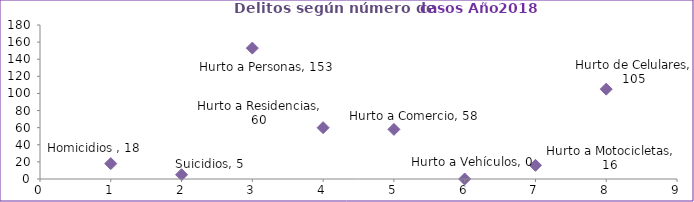
| Category | Series 0 |
|---|---|
| 0 | 18 |
| 1 | 5 |
| 2 | 153 |
| 3 | 60 |
| 4 | 58 |
| 5 | 0 |
| 6 | 16 |
| 7 | 105 |